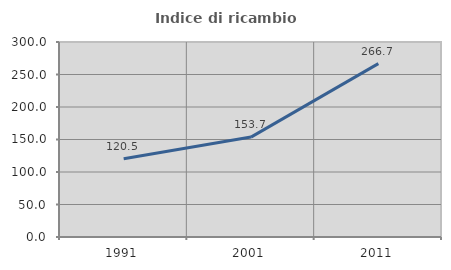
| Category | Indice di ricambio occupazionale  |
|---|---|
| 1991.0 | 120.513 |
| 2001.0 | 153.704 |
| 2011.0 | 266.667 |